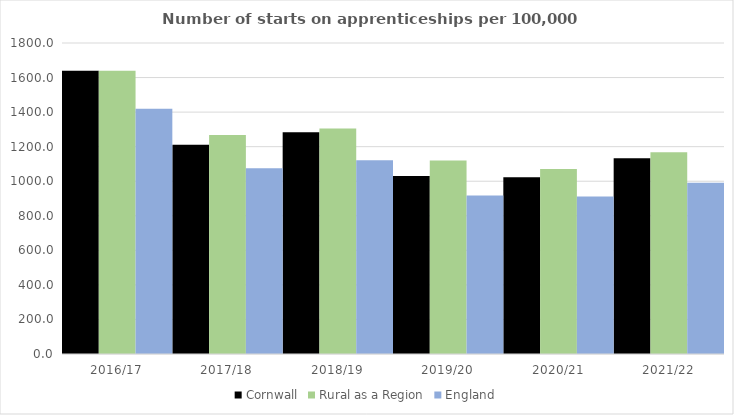
| Category | Cornwall | Rural as a Region | England |
|---|---|---|---|
| 2016/17 | 1640 | 1638.789 | 1420 |
| 2017/18 | 1211 | 1267.474 | 1075 |
| 2018/19 | 1284 | 1304.57 | 1122 |
| 2019/20 | 1030 | 1119.662 | 918 |
| 2020/21 | 1023 | 1070.748 | 912 |
| 2021/22 | 1133 | 1167.68 | 991 |